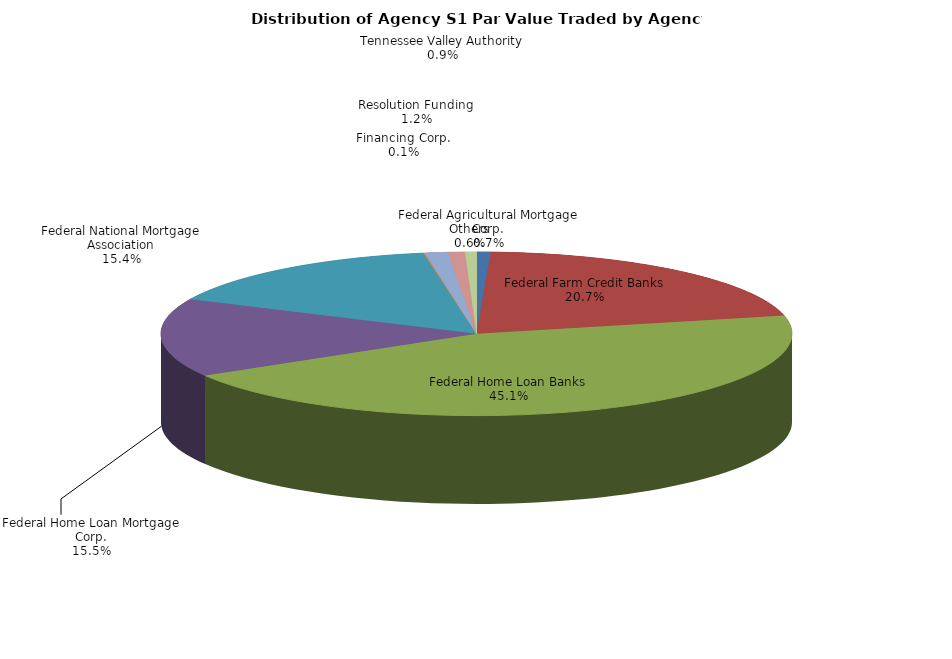
| Category | Series 0 |
|---|---|
| Federal Agricultural Mortgage Corp. | 24998617.53 |
| Federal Farm Credit Banks | 722435159.363 |
| Federal Home Loan Banks | 1572560390.484 |
| Federal Home Loan Mortgage Corp. | 539832897.211 |
| Federal National Mortgage Association | 536442424.559 |
| Financing Corp. | 2243880.478 |
| Resolution Funding | 41309728.375 |
| Tennessee Valley Authority | 30111351.258 |
| Others | 20433605.421 |